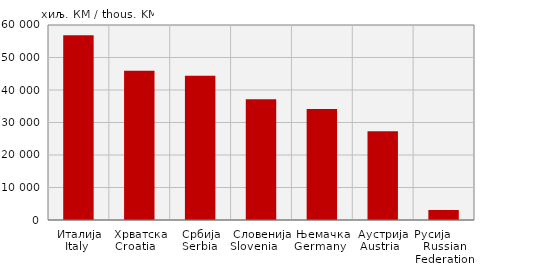
| Category | Извоз
Export |
|---|---|
| Италија
Italy  | 56827 |
| Хрватска
Croatia    | 45904 |
| Србија
Serbia  | 44412 |
| Словенија
Slovenia            | 37187 |
| Њемачка
Germany   | 34132 |
| Аустрија
Austria   | 27330 |
| Русија        Russian Federation | 3084 |